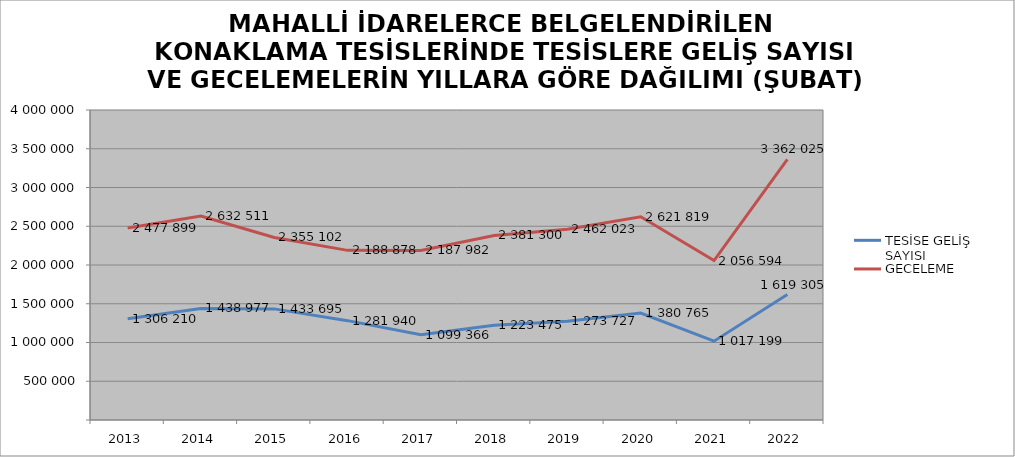
| Category | TESİSE GELİŞ SAYISI | GECELEME |
|---|---|---|
| 2013 | 1306210 | 2477899 |
| 2014 | 1438977 | 2632511 |
| 2015 | 1433695 | 2355102 |
| 2016 | 1281940 | 2188878 |
| 2017 | 1099366 | 2187982 |
| 2018 | 1223475 | 2381300 |
| 2019 | 1273727 | 2462023 |
| 2020 | 1380765 | 2621819 |
| 2021 | 1017199 | 2056594 |
| 2022 | 1619305 | 3362025 |